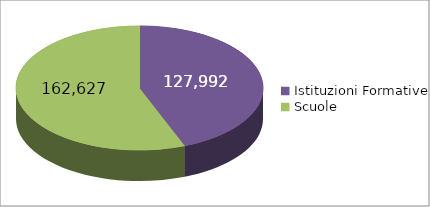
| Category | Series 0 |
|---|---|
| Istituzioni Formative | 127992 |
| Scuole | 162627 |